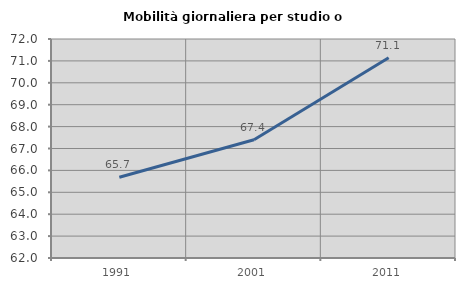
| Category | Mobilità giornaliera per studio o lavoro |
|---|---|
| 1991.0 | 65.684 |
| 2001.0 | 67.4 |
| 2011.0 | 71.147 |